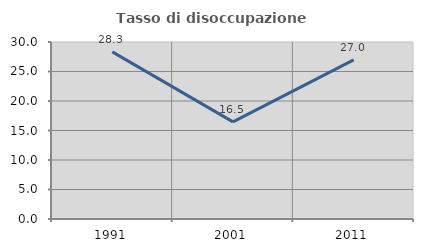
| Category | Tasso di disoccupazione giovanile  |
|---|---|
| 1991.0 | 28.33 |
| 2001.0 | 16.462 |
| 2011.0 | 26.981 |